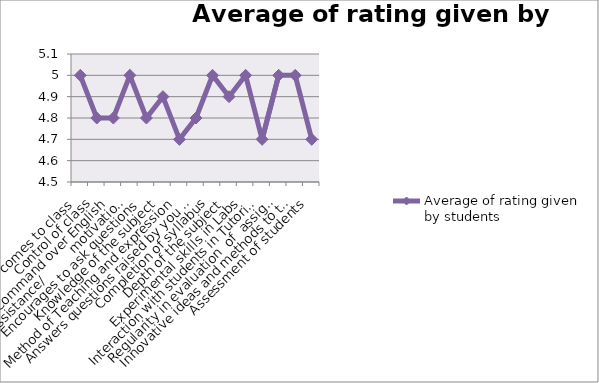
| Category | Average of rating given by students |
|---|---|
| teacher comes to class | 5 |
| Control of class | 4.8 |
| Command over English | 4.8 |
| Offers assistance/          motivation to learn | 5 |
| Encourages to ask questions | 4.8 |
| Knowledge of the subject | 4.9 |
| Method of Teaching and expression | 4.7 |
| Answers questions raised by you as per expectations | 4.8 |
| Completion of syllabus | 5 |
| Depth of the subject | 4.9 |
| Experimental skills in Labs  | 5 |
| Interaction with students in Tutorial class | 4.7 |
| Regularity in evaluation  of  assignments, class tests etc. | 5 |
| Innovative ideas and methods to teach | 5 |
| Assessment of students | 4.7 |